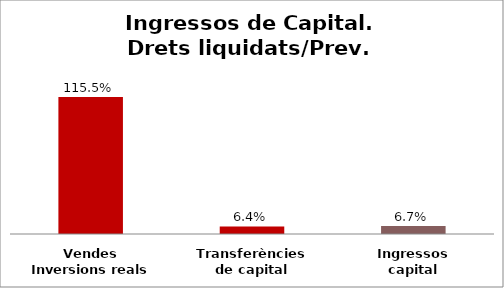
| Category | Series 0 |
|---|---|
| Vendes Inversions reals | 1.155 |
| Transferències de capital | 0.064 |
| Ingressos capital | 0.067 |